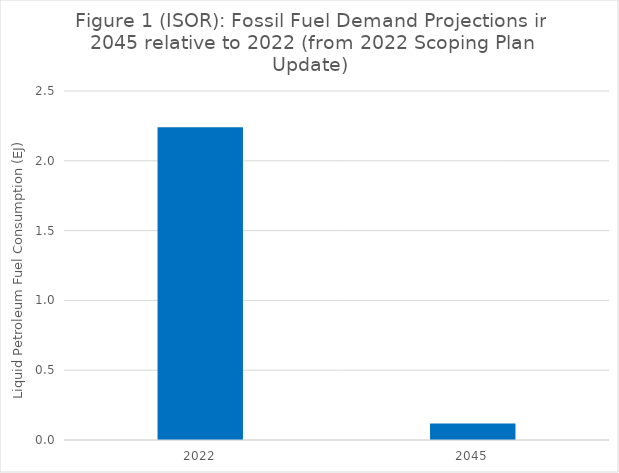
| Category | Liquid Petroleum Fuel Consumption (EJ) |
|---|---|
| 2022.0 | 2.24 |
| 2045.0 | 0.118 |